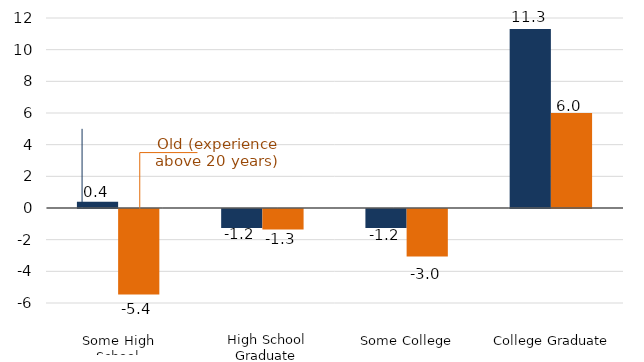
| Category | Young | Old |
|---|---|---|
| Some High School | 0.4 | -5.4 |
| High School Graduate | -1.2 | -1.3 |
| Some College | -1.2 | -3 |
| College Graduate | 11.3 | 6 |